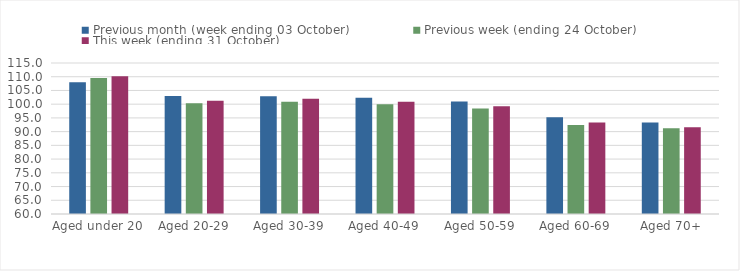
| Category | Previous month (week ending 03 October) | Previous week (ending 24 October) | This week (ending 31 October) |
|---|---|---|---|
| Aged under 20 | 108.02 | 109.54 | 110.15 |
| Aged 20-29 | 102.97 | 100.31 | 101.28 |
| Aged 30-39 | 102.92 | 100.86 | 101.95 |
| Aged 40-49 | 102.36 | 100 | 100.91 |
| Aged 50-59 | 101.01 | 98.45 | 99.28 |
| Aged 60-69 | 95.24 | 92.38 | 93.36 |
| Aged 70+ | 93.31 | 91.23 | 91.58 |